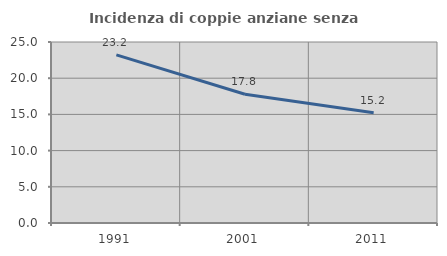
| Category | Incidenza di coppie anziane senza figli  |
|---|---|
| 1991.0 | 23.214 |
| 2001.0 | 17.778 |
| 2011.0 | 15.217 |